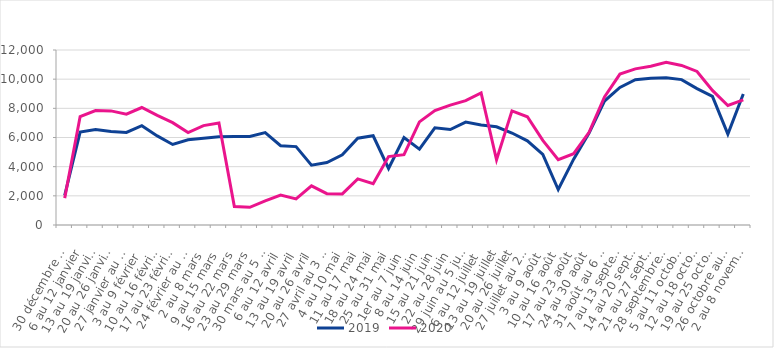
| Category | 2019 | 2020 |
|---|---|---|
| 30 décembre au 5 janvier | 2040 | 1843 |
| 6 au 12 janvier | 6370 | 7438 |
| 13 au 19 janvier | 6554 | 7852 |
| 20 au 26 janvier | 6407 | 7824 |
| 27 janvier au 2 février | 6351 | 7604 |
| 3 au 9 février | 6808 | 8056 |
| 10 au 16 février | 6108 | 7512 |
| 17 au 23 février | 5521 | 7019 |
| 24 février au 1er mars | 5849 | 6338 |
| 2 au 8 mars | 5944 | 6813 |
| 9 au 15 mars | 6046 | 6995 |
| 16 au 22 mars | 6069 | 1262 |
| 23 au 29 mars | 6072 | 1214 |
| 30 mars au 5 avril | 6339 | 1652 |
| 6 au 12 avril | 5437 | 2048 |
| 13 au 19 avril | 5376 | 1786 |
| 20 au 26 avril | 4100 | 2688 |
| 27 avril au 3 mai | 4284 | 2148 |
| 4 au 10 mai | 4818 | 2132 |
| 11 au 17 mai | 5953 | 3159 |
| 18 au 24 mai | 6120 | 2835 |
| 25 au 31 mai | 3877 | 4690 |
| 1er au 7 juin | 5999 | 4821 |
| 8 au 14 juin | 5197 | 7070 |
| 15 au 21 juin | 6668 | 7850 |
| 22 au 28 juin | 6548 | 8224 |
| 29 juin au 5 juillet | 7057 | 8523 |
| 6 au 12 juillet | 6862 | 9058 |
| 13 au 19 juillet | 6737 | 4471 |
| 20 au 26 juillet | 6309 | 7826 |
| 27 juillet au 2 août | 5772 | 7422 |
| 3 au 9 août | 4840 | 5800 |
| 10 au 16 août | 2432 | 4484 |
| 17 au 23 août | 4517 | 4889 |
| 24 au 30 août | 6304 | 6356 |
| 31 août au 6 septembre | 8500 | 8781 |
| 7 au 13 septembre | 9436 | 10351 |
| 14 au 20 septembre | 9967 | 10708 |
| 21 au 27 septembre | 10067 | 10890 |
| 28 septembre au 4 octobre | 10096 | 11151 |
| 5 au 11 octobre | 9971 | 10943 |
| 12 au 18 octobre | 9350 | 10530 |
| 19 au 25 octobre | 8823 | 9230 |
| 26 octobre au 1er novembre | 6232 | 8195 |
| 2 au 8 novembre | 8987 | 8574 |